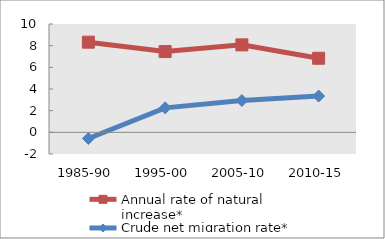
| Category | Annual rate of natural increase* | Crude net migration rate* |
|---|---|---|
| 1985-90 | 8.322 | -0.565 |
| 1995-00 | 7.455 | 2.261 |
| 2005-10 | 8.074 | 2.936 |
| 2010-15 | 6.838 | 3.347 |